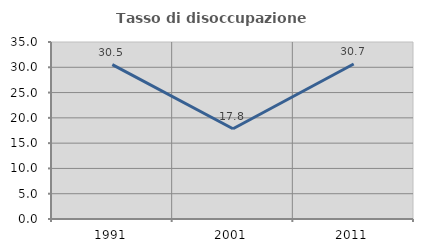
| Category | Tasso di disoccupazione giovanile  |
|---|---|
| 1991.0 | 30.523 |
| 2001.0 | 17.849 |
| 2011.0 | 30.65 |